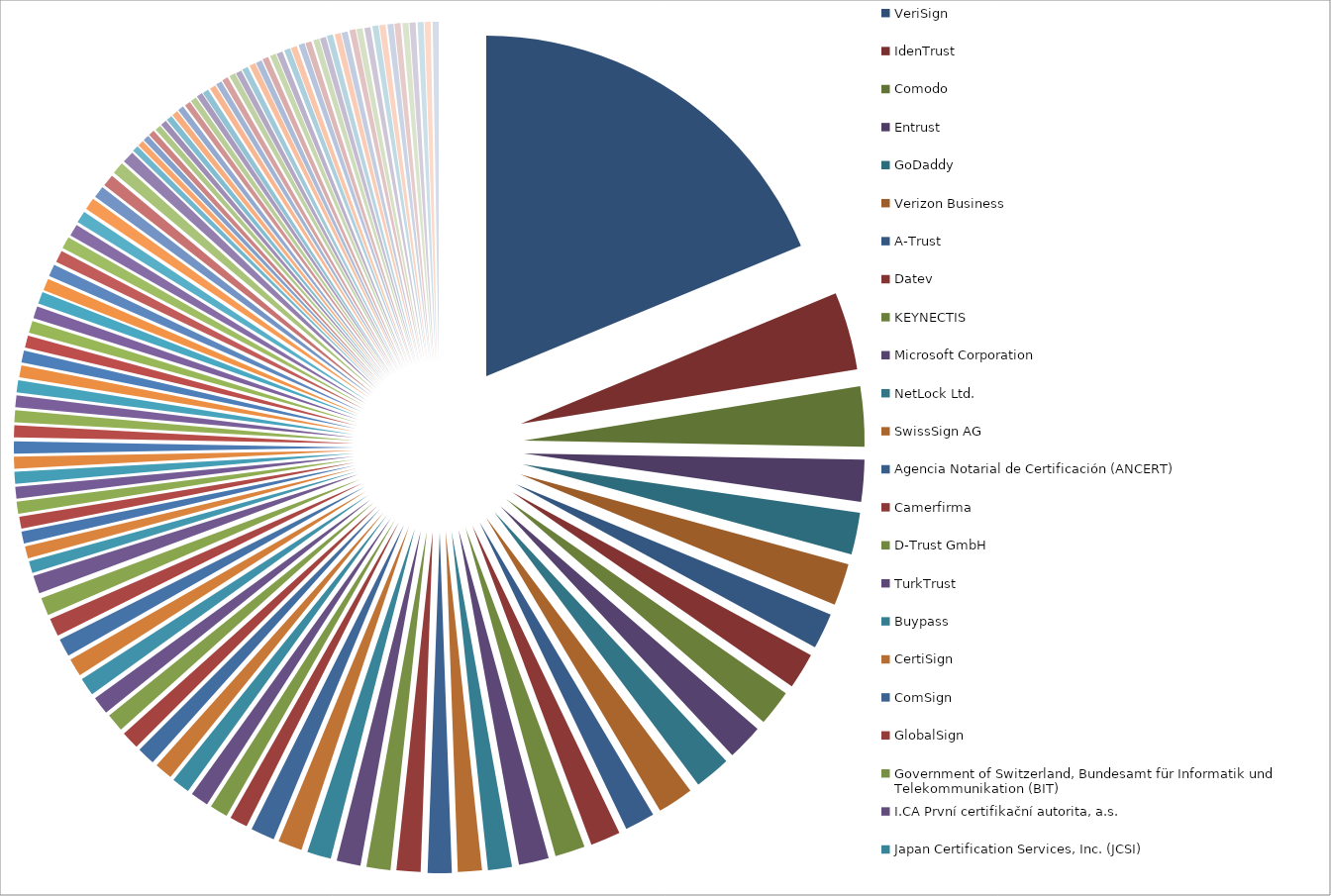
| Category | Count |
|---|---|
| VeriSign   | 66 |
| IdenTrust   | 13 |
| Comodo   | 10 |
| Entrust   | 7 |
| GoDaddy   | 7 |
| Verizon Business   | 7 |
| A-Trust   | 6 |
| Datev   | 6 |
| KEYNECTIS   | 6 |
| Microsoft Corporation   | 6 |
| NetLock Ltd.   | 6 |
| SwissSign AG   | 6 |
| Agencia Notarial de Certificación (ANCERT)   | 5 |
| Camerfirma   | 5 |
| D-Trust GmbH   | 5 |
| TurkTrust   | 5 |
| Buypass   | 4 |
| CertiSign   | 4 |
| ComSign   | 4 |
| GlobalSign   | 4 |
| Government of Switzerland, Bundesamt für Informatik und Telekommunikation (BIT)   | 4 |
| I.CA První certifikační autorita, a.s.   | 4 |
| Japan Certification Services, Inc. (JCSI)   | 4 |
| SECOM Trust Systems Co. Ltd.   | 4 |
| Trend Micro (was AffirmTrust)   | 4 |
| Austrian Society for Data Protection (Arge Daten)   | 3 |
| Certicámara S.A.   | 3 |
| Certipost s.a./n.v.   | 3 |
| DigiCert   | 3 |
| Government of Korea, Korea Information Security Agency (KISA)   | 3 |
| Government of Korea, Ministry of Public Administration And Security (MOPAS)   | 3 |
| Government of South Africa, South African Post   | 3 |
| Government of the United States of America, Federal PKI   | 3 |
| Internet Publishing Services s.l. (ipsCA)   | 3 |
| QuoVadis   | 3 |
| Serasa   | 3 |
| Skaitmeninio sertifikavimo centras (SSC)   | 3 |
| TeliaSonera   | 3 |
| Trustwave   | 3 |
| Unizeto CERTUM  | 3 |
| Actalis S.p.A.   | 2 |
| AOL   | 2 |
| AS Sertifitseerimiskeskus   | 2 |
| Autoridad de Certificacion Firmaprofesional   | 2 |
| Certigna   | 2 |
| China Internet Network Information Center (CNNIC)   | 2 |
| Colegio de Registradores Mercantile (Spanish Property & Commerce Registry)   | 2 |
| DanID   | 2 |
| Government of Brazil, Instituto Nacional de Tecnologia da Informação (ITI)   | 2 |
| Government of France   | 2 |
| Government of Hong Kong (SAR), Hongkong Post   | 2 |
| Government of India, Ministry of Communications & Information Technology, Controller of Certifying Authorities (CCA)   | 2 |
| Government of Japan, Ministry of Internal Affairs and Communications   | 2 |
| Government of Spain (CAV), Izenpe S.A.   | 2 |
| Government of Spain, Fábrica Nacional de Moneda y Timbre (FNMT)   | 2 |
| Government of The Netherlands, PKIoverheid   | 2 |
| Government of Tunisia, Agence National de Certification Electronique / National Digital Certification Agency (ANCE/NDCA)   | 2 |
| Government of Venezuela, Superintendencia de Servicios de Certificación Electrónica (SUSCERTE)   | 2 |
| Halcom D.D.   | 2 |
| Microsec e-Szignó CA   | 2 |
| Network Solutions   | 2 |
| Post.Trust   | 2 |
| RSA Security   | 2 |
| Shanghai Electronic Certification Authority Co. Ltd. (SHECA)   | 2 |
| Swisscom Solutions AG   | 2 |
| TAIWAN-CA INC.  | 2 |
| Trustis Limited   | 2 |
| T-Systems (Deutsche Telekom)  | 2 |
| Visa   | 2 |
| Wells Fargo Bank N.A.   | 2 |
| Agencia Catalana de Certificacio (CATCert)   | 1 |
| Atos   | 1 |
| Autoridad de Certificación (ANF AC)   | 1 |
| CA Disig a.s.   | 1 |
| CertEurope France   | 1 |
| Certinomis   | 1 |
| certSIGN   | 1 |
| Česká pošta (Czech Post, PostSignum)   | 1 |
| Chunghwa Telecom Corporation   | 1 |
| Cisco Systems   | 1 |
| E-Certchile   | 1 |
| Echoworx   | 1 |
| EDICOM   | 1 |
| e-Guven Elektronik Bilgi Guvenligi A.S.   | 1 |
| e-tugra   | 1 |
| Government of Austria, Austria Telekom-Control Commission   | 1 |
| Government of Brazil, Autoridade Certificadora Raiz Brasileira   | 1 |
| Government of Finland, Population Register Centre   | 1 |
| Government of Latvia, Latvian Post   | 1 |
| Government of Latvia, Latvian State Radio & Television Centre (LVRTC)   | 1 |
| Government of Lithuania, Registru Centras   | 1 |
| Government of Macao, Macao Post   | 1 |
| Government of Mexico, Autoridad Certificadora Raiz de la Secretaria de Economia   | 1 |
| Government of Portugal, Sistema de Certificação Electrónica do Estado (SCEE) / Electronic Certification System of the State   | 1 |
| Government of Serbia, PTT saobraćaja „Srbija” (Serbian Post)   | 1 |
| Government of Slovenia, Posta Slovenije (POSTArCA)   | 1 |
| Government of Slovenia, Slovenian General Certification Authority (SIGEN-CA)   | 1 |
| Government of Slovenia, Slovenian Governmental Certification Authority (SIGOV-CA)   | 1 |
| Government of Spain, Autoritat de Certificació de la Comunitat Valenciana (ACCV)   | 1 |
| Government of Spain, Dirección General de la Policía – Ministerio del Interior – España.   | 1 |
| Government of Spain, Ministerio de Trabajo e Inmigración (MTIN)   | 1 |
| Government of Sweden (Försäkringskassan )  | 1 |
| Government of Sweden, Inera AB (SITHS-Secure IT within Health care Service)   | 1 |
| Government of Taiwan, Government Root Certification Authority (GRCA)   | 1 |
| Government of Turkey, Kamu Sertifikasyon Merkezi (Kamu SM)   | 1 |
| Government of Uruguay, Correo Uruguayo   | 1 |
| Infonotary Plc   | 1 |
| LuxTrust S.A.   | 1 |
| Natixis   | 1 |
| Netrust Pte Ltd   | 1 |
| Nova Ljubljanska Banka d.d. (NLB)   | 1 |
| Personal I.D ltd   | 1 |
| Red Abogacía   | 1 |
| Start Commercial (StartCom) Ltd.   | 1 |
| S-TRUST   | 1 |